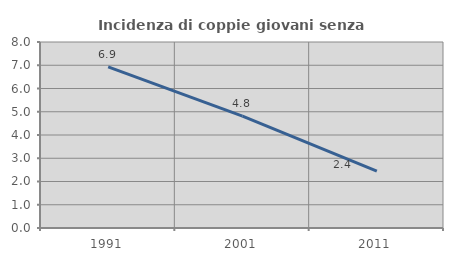
| Category | Incidenza di coppie giovani senza figli |
|---|---|
| 1991.0 | 6.934 |
| 2001.0 | 4.815 |
| 2011.0 | 2.446 |